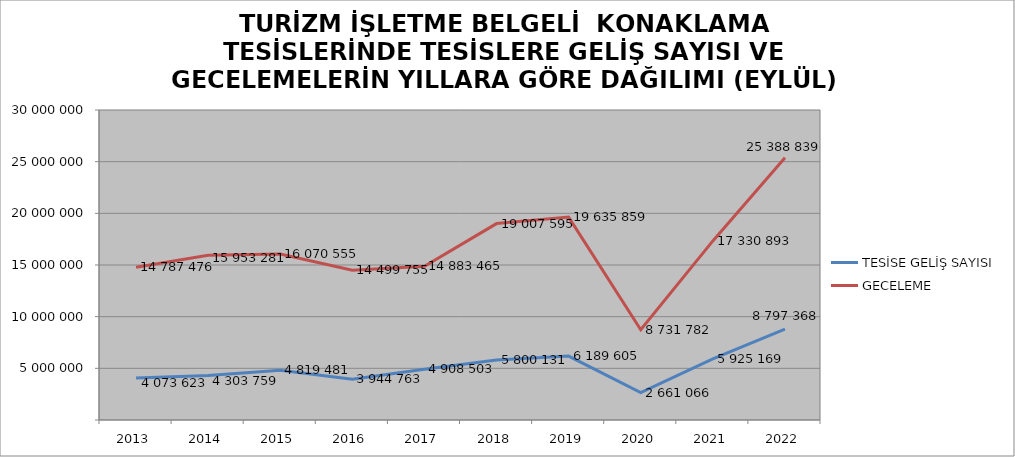
| Category | TESİSE GELİŞ SAYISI | GECELEME |
|---|---|---|
| 2013 | 4073623 | 14787476 |
| 2014 | 4303759 | 15953281 |
| 2015 | 4819481 | 16070555 |
| 2016 | 3944763 | 14499755 |
| 2017 | 4908503 | 14883465 |
| 2018 | 5800131 | 19007595 |
| 2019 | 6189605 | 19635859 |
| 2020 | 2661066 | 8731782 |
| 2021 | 5925169 | 17330893 |
| 2022 | 8797368 | 25388839 |